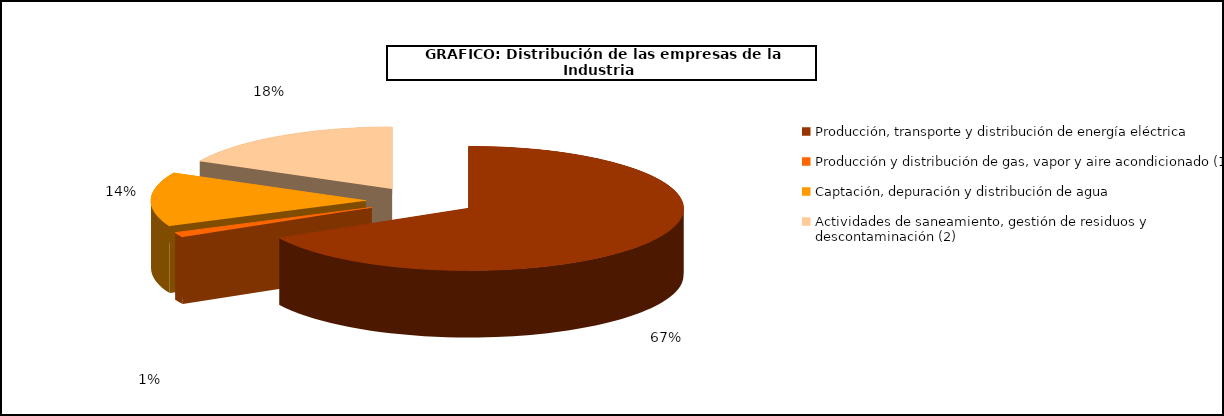
| Category | Series 0 |
|---|---|
| Producción, transporte y distribución de energía eléctrica | 14211 |
| Producción y distribución de gas, vapor y aire acondicionado (1) | 264 |
| Captación, depuración y distribución de agua | 2978 |
| Actividades de saneamiento, gestión de residuos y descontaminación (2) | 3732 |